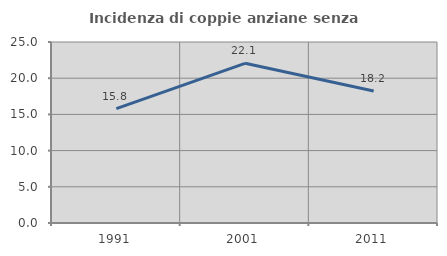
| Category | Incidenza di coppie anziane senza figli  |
|---|---|
| 1991.0 | 15.806 |
| 2001.0 | 22.059 |
| 2011.0 | 18.22 |